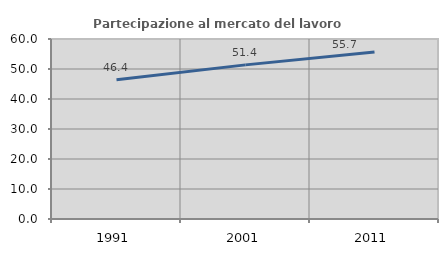
| Category | Partecipazione al mercato del lavoro  femminile |
|---|---|
| 1991.0 | 46.396 |
| 2001.0 | 51.377 |
| 2011.0 | 55.681 |